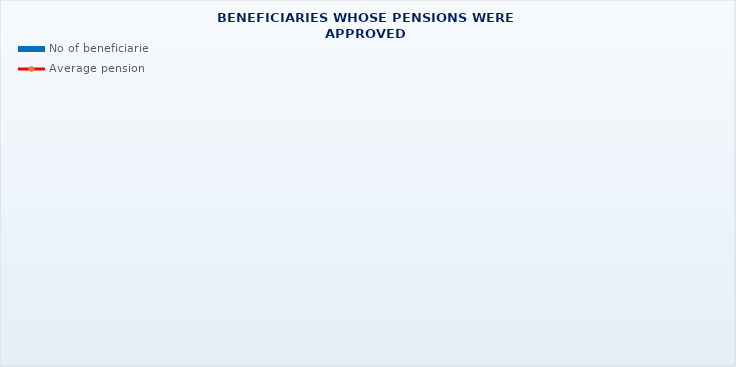
| Category | No of beneficiaries |
|---|---|
| Authorised officials in internal affairs, judicial officers and workers engaged in demining work: | 17264 |
| Active military personnel - DVO  | 15640 |
| Croatian Homeland Army veterans mobilised from 1941 to 1945 | 3976 |
| Former political prisoners | 2795 |
| Croatian Veterans from the Homeland War - ZOHBDR (Act on the Rights of Croatian Homeland War Veterans and their Family Members) | 71253 |
| Pensions approved under general regulations and determined according to the Act on the Rights of Croatian Homeland War Veterans and their Family Members (ZOHBDR), in 2017 (Art. 27, 35, 48 and 49, paragraph 2)    | 43071 |
| Former Yugoslav People's Army members - JNA   | 5368 |
| Former Yugoslav People's Army members - JNA - Art. 185 of Pension Insurance Act (ZOMO)  | 142 |
| National Liberation War veterans - NOR | 9476 |
| Members of the Croatian Parliament, members of the Government, judges of the Constitutional Court and the Auditor General | 673 |
| Members of the Parliamentary Executive Council and administratively retired federal civil servants  (relates to the former SFRY) | 94 |
| Former officials of federal bodies o the former SFRJ -  Article 38 of the Pension Insurance Act (ZOMO) | 33 |
| Full members of the Croatian Academy of Sciences and Arts - HAZU | 140 |
| Miners from the Istrian coal mines "Tupljak" d.d. Labin  | 254 |
| Workers professionally exposed to asbestos | 869 |
| Insurees - crew members on a ship in international and national navigation  - Article  129, paragraph 2 of the Maritime Code | 178 |
| Members of the Croatian Defence Council - HVO  | 6725 |